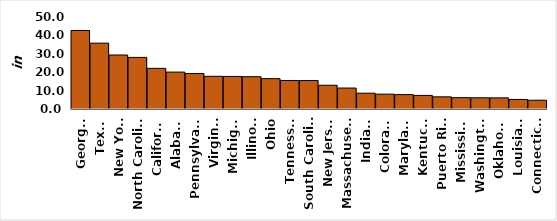
| Category | Series 0 |
|---|---|
| Georgia | 42666 |
| Texas | 35777 |
| New York | 29344 |
| North Carolina | 28044 |
| California | 22094 |
| Alabama | 20063 |
| Pennsylvania | 19299 |
| Virginia | 17773 |
| Michigan | 17712 |
| Illinois | 17548 |
| Ohio | 16492 |
| Tennessee | 15491 |
| South Carolina | 15476 |
| New Jersey | 12907 |
| Massachusetts | 11396 |
| Indiana | 8595 |
| Colorado | 8075 |
| Maryland | 7825 |
| Kentucky | 7400 |
| Puerto Rico | 6614 |
| Mississippi | 6152 |
| Washington | 6094 |
| Oklahoma | 6056 |
| Louisiana | 5193 |
| Connecticut | 4771 |